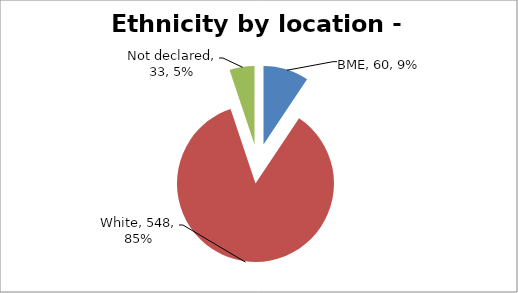
| Category | Series 0 |
|---|---|
| BME | 60 |
| White | 548 |
| Not declared | 33 |